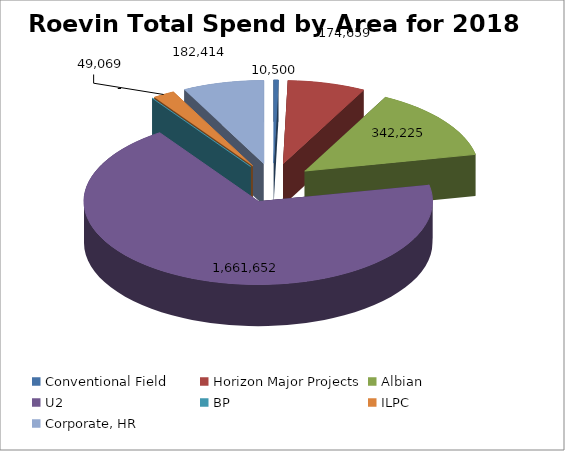
| Category | 2018 |
|---|---|
| Conventional Field | 10500 |
| Horizon Major Projects | 174659.4 |
| Albian  | 342225.43 |
| U2 | 1661651.62 |
| BP | 0 |
| ILPC | 49069.38 |
| Corporate, HR | 182413.92 |